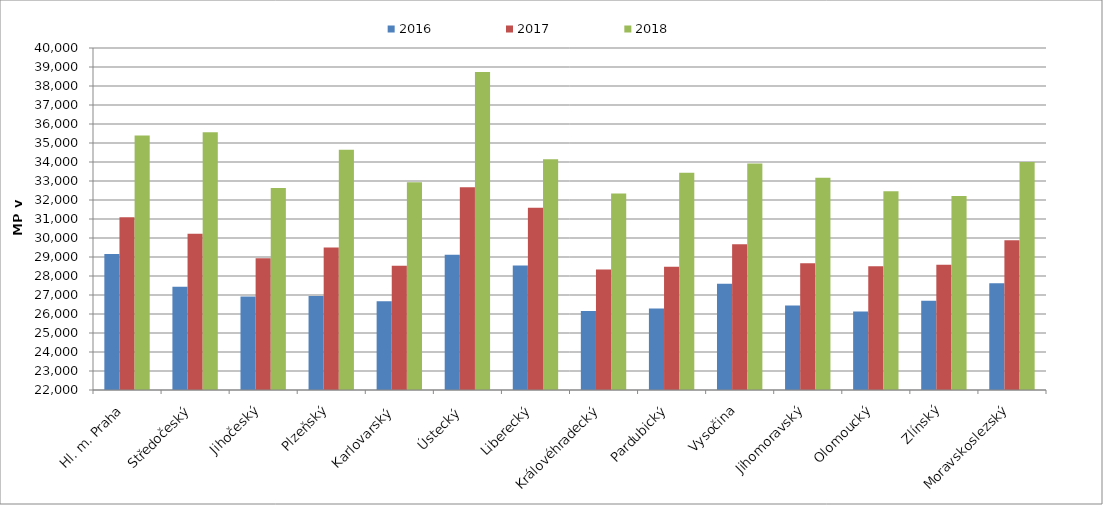
| Category | 2016 | 2017 | 2018 |
|---|---|---|---|
| Hl. m. Praha | 29162.531 | 31093.346 | 35399.201 |
| Středočeský | 27435.91 | 30219.502 | 35559.785 |
| Jihočeský | 26918.359 | 28934.987 | 32627.109 |
| Plzeňský | 26947.135 | 29500.177 | 34645.275 |
| Karlovarský  | 26672.272 | 28544.129 | 32928.23 |
| Ústecký   | 29114.406 | 32674.003 | 38737.88 |
| Liberecký | 28558.554 | 31595.86 | 34140.735 |
| Královéhradecký | 26154.473 | 28347.63 | 32342.184 |
| Pardubický | 26290.044 | 28480.433 | 33432.247 |
| Vysočina | 27590.257 | 29673.19 | 33924.8 |
| Jihomoravský | 26442.372 | 28669.979 | 33171.232 |
| Olomoucký | 26133.869 | 28511.113 | 32459.553 |
| Zlínský | 26698.87 | 28598.367 | 32211.334 |
| Moravskoslezský | 27616.815 | 29877.656 | 33995.159 |